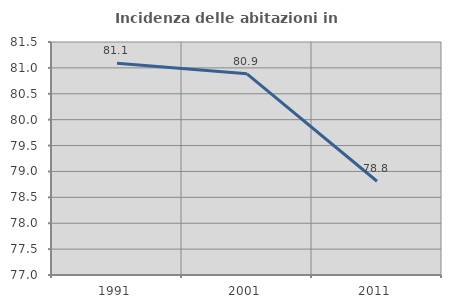
| Category | Incidenza delle abitazioni in proprietà  |
|---|---|
| 1991.0 | 81.092 |
| 2001.0 | 80.885 |
| 2011.0 | 78.81 |